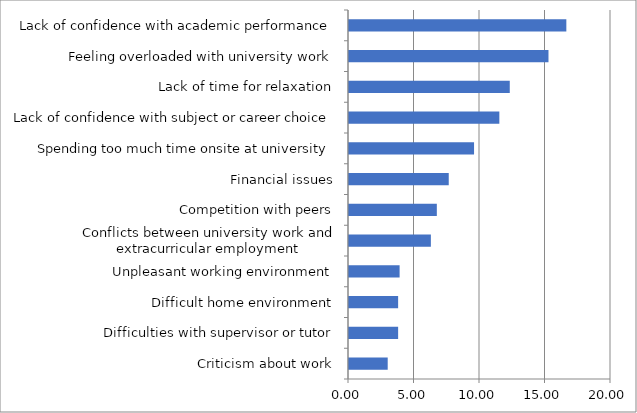
| Category | Series 0 |
|---|---|
| Criticism about work | 2.955 |
| Difficulties with supervisor or tutor | 3.75 |
| Difficult home environment | 3.75 |
| Unpleasant working environment | 3.864 |
| Conflicts between university work and extracurricular employment | 6.25 |
| Competition with peers | 6.705 |
| Financial issues | 7.614 |
| Spending too much time onsite at university | 9.545 |
| Lack of confidence with subject or career choice | 11.477 |
| Lack of time for relaxation | 12.273 |
| Feeling overloaded with university work | 15.227 |
| Lack of confidence with academic performance | 16.591 |